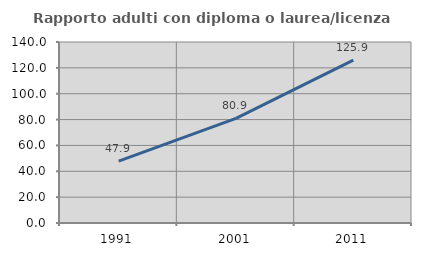
| Category | Rapporto adulti con diploma o laurea/licenza media  |
|---|---|
| 1991.0 | 47.872 |
| 2001.0 | 80.899 |
| 2011.0 | 125.912 |